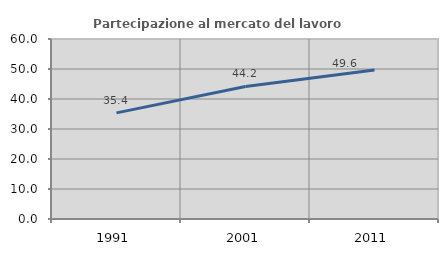
| Category | Partecipazione al mercato del lavoro  femminile |
|---|---|
| 1991.0 | 35.366 |
| 2001.0 | 44.171 |
| 2011.0 | 49.645 |